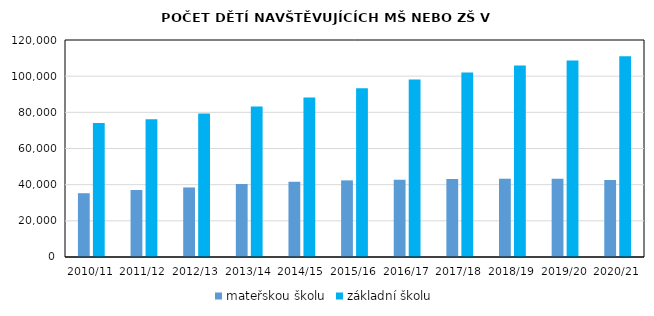
| Category | mateřskou školu | základní školu |
|---|---|---|
| 2010/11 | 35264 | 74151 |
| 2011/12 | 37078 | 76189 |
| 2012/13 | 38457 | 79310 |
| 2013/14 | 40405 | 83241 |
| 2014/15 | 41637 | 88184 |
| 2015/16 | 42371 | 93298 |
| 2016/17 | 42711 | 98126 |
| 2017/18 | 43147 | 102077 |
| 2018/19 | 43288 | 105887 |
| 2019/20 | 43260 | 108638 |
| 2020/21 | 42578 | 110975 |